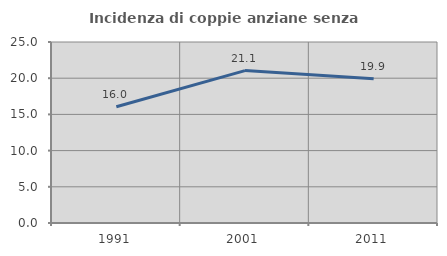
| Category | Incidenza di coppie anziane senza figli  |
|---|---|
| 1991.0 | 16.048 |
| 2001.0 | 21.053 |
| 2011.0 | 19.92 |